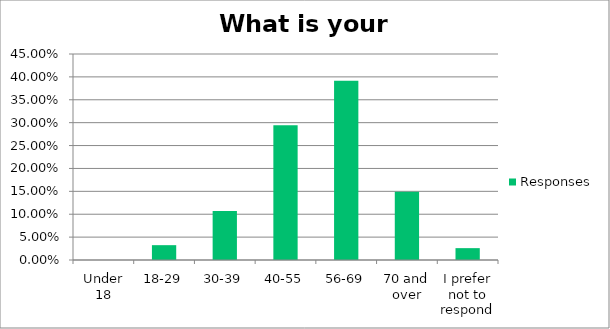
| Category | Responses |
|---|---|
| Under 18 | 0 |
| 18-29 | 0.032 |
| 30-39 | 0.107 |
| 40-55 | 0.294 |
| 56-69 | 0.392 |
| 70 and over | 0.149 |
| I prefer not to respond | 0.026 |